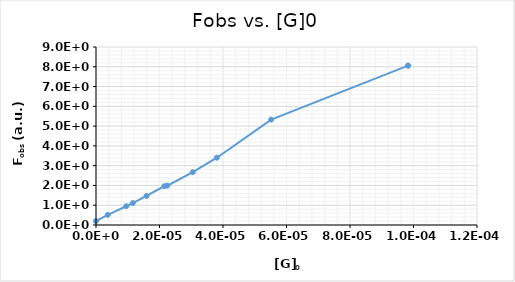
| Category | Fobs |
|---|---|
| 0.0 | 197196.781 |
| 3.7175826790387816e-06 | 513542.625 |
| 9.517011658339281e-06 | 949192.688 |
| 1.1598857958600999e-05 | 1109962.88 |
| 1.5911253866285985e-05 | 1469121.25 |
| 2.1561979538424933e-05 | 1967506 |
| 2.245419938139424e-05 | 1988880 |
| 3.048417796811801e-05 | 2669937.25 |
| 3.8068046633357124e-05 | 3403119 |
| 5.516892695693552e-05 | 5328053.5 |
| 9.82928860337854e-05 | 8056731.5 |
| 9.82928860337854e-05 | 8056731.5 |